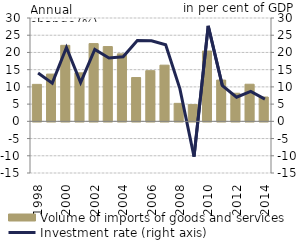
| Category | Volume of imports of goods and services |
|---|---|
| 1998.0 | 10.734 |
| 1999.0 | 13.717 |
| 2000.0 | 22.064 |
| 2001.0 | 14.078 |
| 2002.0 | 22.574 |
| 2003.0 | 21.708 |
| 2004.0 | 19.59 |
| 2005.0 | 12.715 |
| 2006.0 | 14.701 |
| 2007.0 | 16.308 |
| 2008.0 | 5.222 |
| 2009.0 | 4.858 |
| 2010.0 | 20.416 |
| 2011.0 | 11.981 |
| 2012.0 | 8.153 |
| 2013.0 | 10.772 |
| 2014.0 | 7.06 |